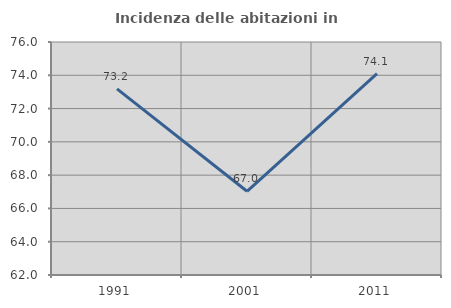
| Category | Incidenza delle abitazioni in proprietà  |
|---|---|
| 1991.0 | 73.182 |
| 2001.0 | 67.029 |
| 2011.0 | 74.095 |